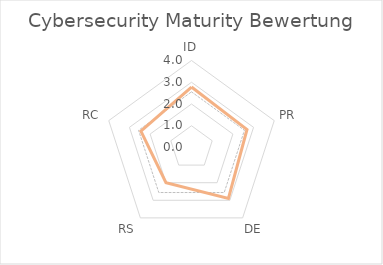
| Category | Average | Series 0 |
|---|---|---|
| ID | 2.559 | 2.781 |
| PR | 2.559 | 2.683 |
| DE | 2.559 | 2.889 |
| RS | 2.559 | 1.997 |
| RC | 2.559 | 2.444 |